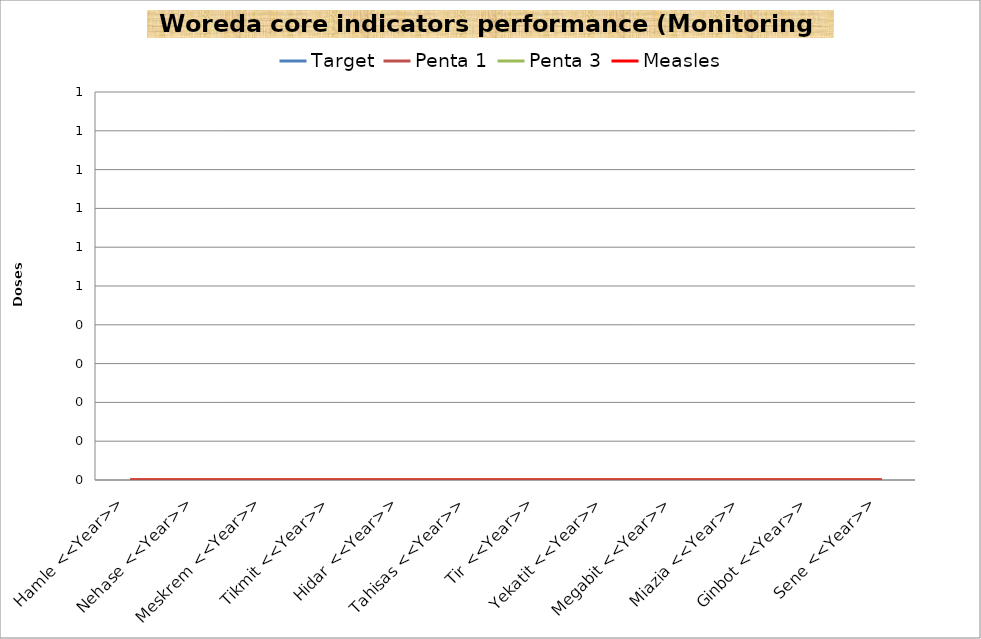
| Category | Target | Penta 1 | Penta 3 | Measles |
|---|---|---|---|---|
| Hamle <<Year>> | 0 | 0 | 0 | 0 |
| Nehase <<Year>> | 0 | 0 | 0 | 0 |
| Meskrem <<Year>> | 0 | 0 | 0 | 0 |
| Tikmit <<Year>> | 0 | 0 | 0 | 0 |
| Hidar <<Year>> | 0 | 0 | 0 | 0 |
| Tahisas <<Year>> | 0 | 0 | 0 | 0 |
| Tir <<Year>> | 0 | 0 | 0 | 0 |
| Yekatit <<Year>> | 0 | 0 | 0 | 0 |
| Megabit <<Year>> | 0 | 0 | 0 | 0 |
| Miazia <<Year>> | 0 | 0 | 0 | 0 |
| Ginbot <<Year>> | 0 | 0 | 0 | 0 |
| Sene <<Year>> | 0 | 0 | 0 | 0 |